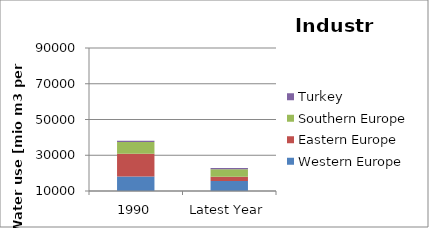
| Category | Western Europe | Eastern Europe | Southern Europe | Turkey |
|---|---|---|---|---|
| 1990 | 18089.5 | 12702.7 | 6559 | 733.5 |
| Latest Year | 15573.9 | 2351.5 | 4280 | 658 |